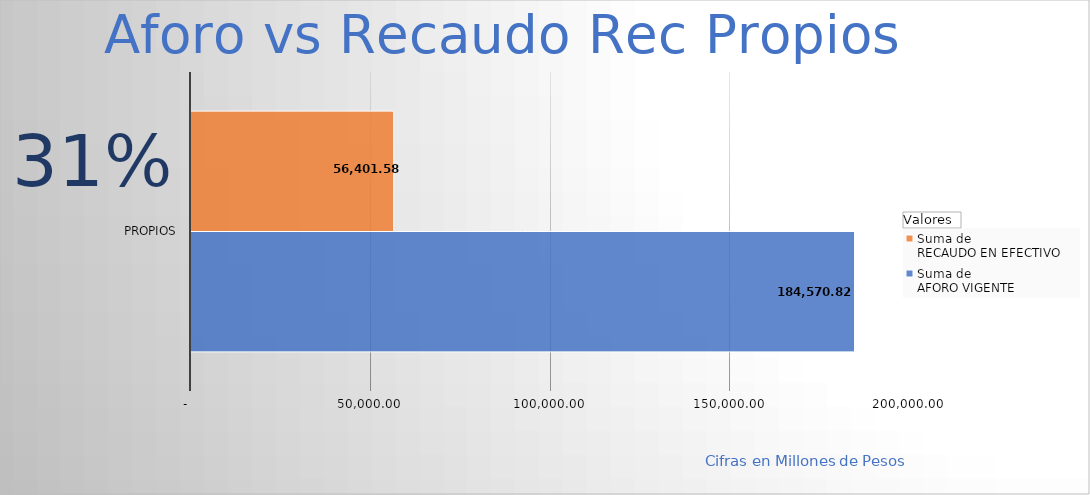
| Category | Suma de 
AFORO VIGENTE
 | Suma de 
RECAUDO EN EFECTIVO 
 |
|---|---|---|
| Propios | 184570.824 | 56401.583 |